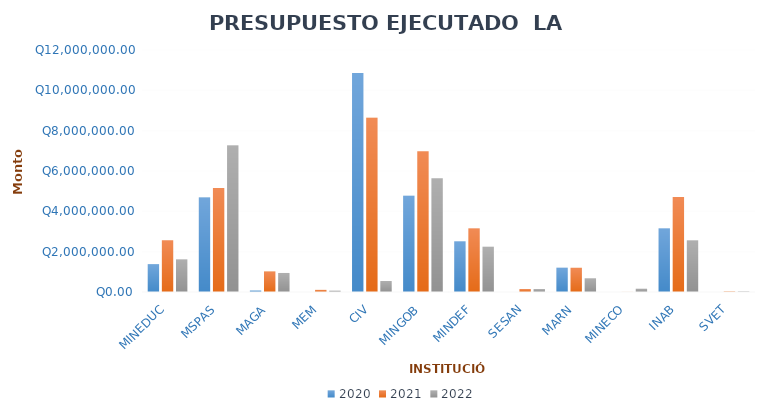
| Category | 2020 | 2021 | 2022 |
|---|---|---|---|
| MINEDUC | 1382594.94 | 2566444.31 | 1619499.74 |
| MSPAS | 4682512 | 5155040 | 7260345 |
| MAGA | 70621.5 | 1015508.98 | 943721.22 |
| MEM | 0 | 105359.91 | 63550.64 |
| CIV | 10860705.06 | 8635283.55 | 544469.17 |
| MINGOB | 4767989.2 | 6983466.4 | 5635171.2 |
| MINDEF | 2514816.56 | 3157619.5 | 2243136.78 |
| SESAN | 0 | 146335.33 | 146335.33 |
| MARN | 1203372.61 | 1199964.38 | 680958.69 |
| MINECO | 0 | 4000 | 160326 |
| INAB | 3158170.34 | 4714272.63 | 2563960.05 |
| SVET | 0 | 25000 | 31500 |